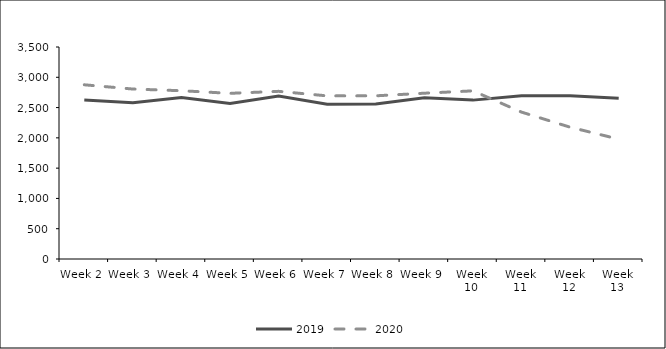
| Category | 2019 | 2020 |
|---|---|---|
| 0 | 2624 | 2876 |
| 1 | 2578 | 2806 |
| 2 | 2668 | 2778 |
| 3 | 2566 | 2735 |
| 4 | 2691 | 2768 |
| 5 | 2556 | 2693 |
| 6 | 2561 | 2694 |
| 7 | 2662 | 2737 |
| 8 | 2623 | 2776 |
| 9 | 2695 | 2425 |
| 10 | 2696 | 2176 |
| 11 | 2655 | 1979 |